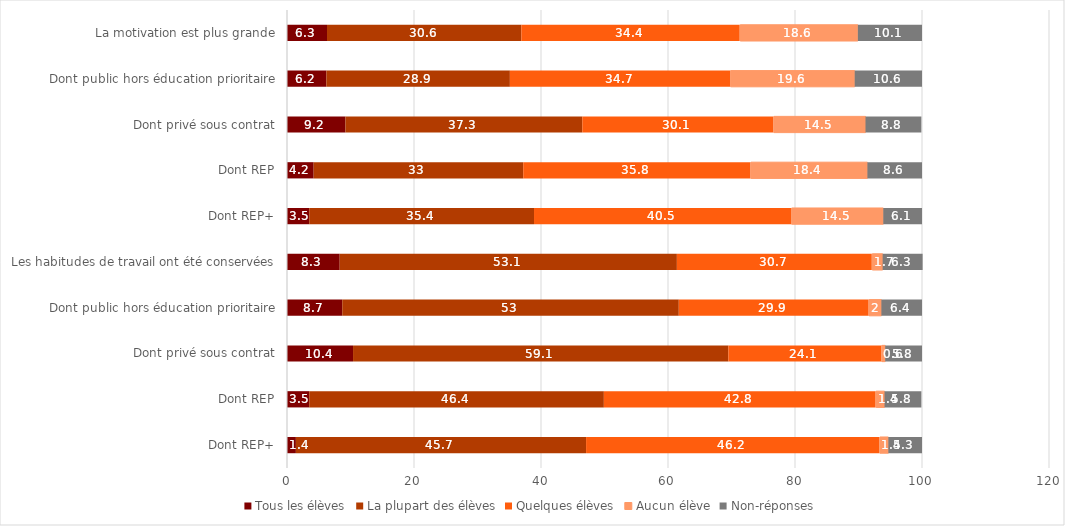
| Category | Tous les élèves | La plupart des élèves | Quelques élèves | Aucun élève | Non-réponses |
|---|---|---|---|---|---|
| Dont REP+ | 1.4 | 45.7 | 46.2 | 1.4 | 5.3 |
| Dont REP | 3.5 | 46.4 | 42.8 | 1.4 | 5.8 |
| Dont privé sous contrat | 10.4 | 59.1 | 24.1 | 0.6 | 5.8 |
| Dont public hors éducation prioritaire | 8.7 | 53 | 29.9 | 2 | 6.4 |
| Les habitudes de travail ont été conservées | 8.3 | 53.1 | 30.7 | 1.7 | 6.3 |
| Dont REP+ | 3.5 | 35.4 | 40.5 | 14.5 | 6.1 |
| Dont REP | 4.2 | 33 | 35.8 | 18.4 | 8.6 |
| Dont privé sous contrat | 9.2 | 37.3 | 30.1 | 14.5 | 8.8 |
| Dont public hors éducation prioritaire | 6.2 | 28.9 | 34.7 | 19.6 | 10.6 |
| La motivation est plus grande | 6.3 | 30.6 | 34.4 | 18.6 | 10.1 |